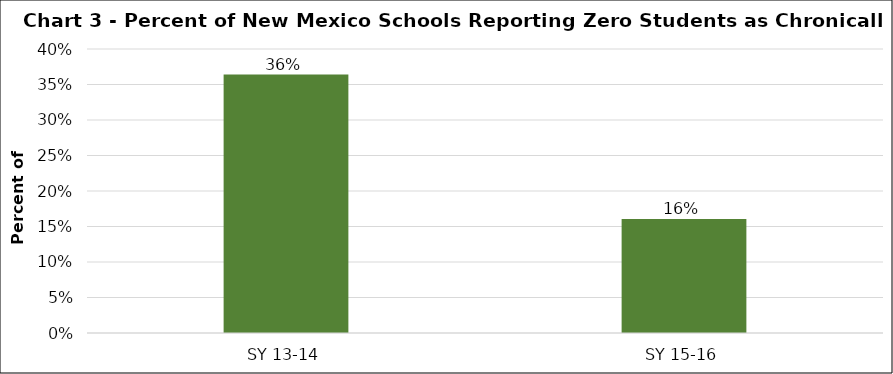
| Category | Series 0 |
|---|---|
| SY 13-14 | 0.364 |
| SY 15-16 | 0.161 |